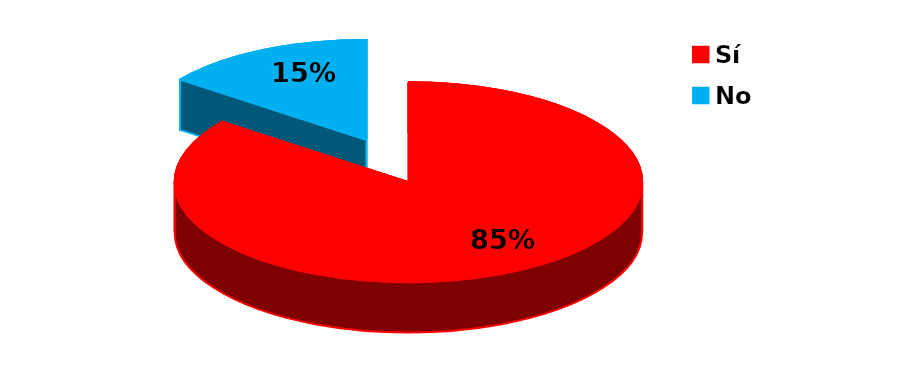
| Category | Series 0 |
|---|---|
| Sí | 93 |
| No | 16 |